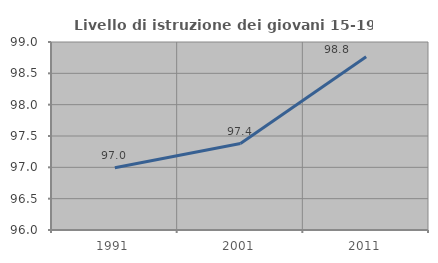
| Category | Livello di istruzione dei giovani 15-19 anni |
|---|---|
| 1991.0 | 96.995 |
| 2001.0 | 97.38 |
| 2011.0 | 98.765 |